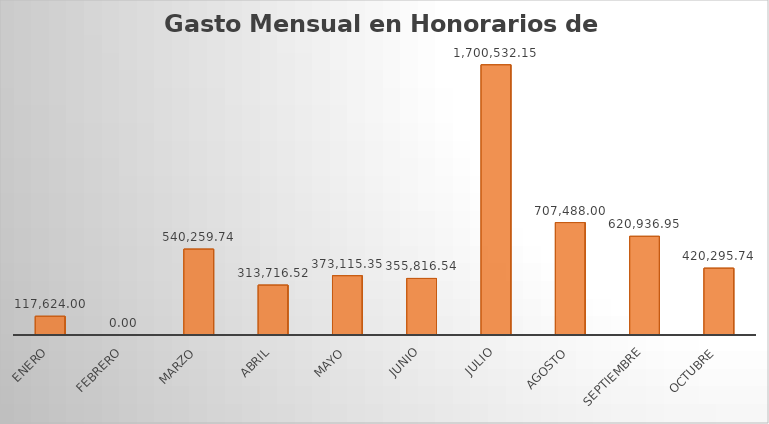
| Category | Monto |
|---|---|
| ENERO | 117624 |
| FEBRERO | 0 |
| MARZO | 540259.74 |
| ABRIL | 313716.52 |
| MAYO | 373115.35 |
| JUNIO | 355816.54 |
| JULIO | 1700532.15 |
| AGOSTO | 707488 |
| SEPTIEMBRE | 620936.95 |
| OCTUBRE | 420295.74 |